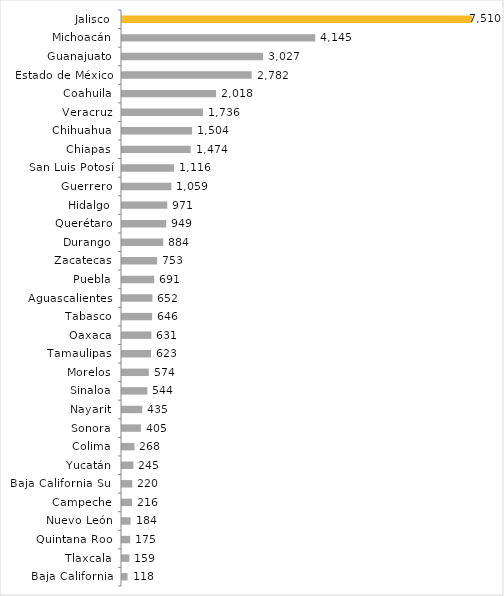
| Category | Producción de Carne en Canal |
|---|---|
| Baja California | 118 |
| Tlaxcala | 159 |
| Quintana Roo | 175 |
| Nuevo León | 184 |
| Campeche | 216 |
| Baja California Sur | 220 |
| Yucatán | 245 |
| Colima | 268 |
| Sonora | 405 |
| Nayarit | 435 |
| Sinaloa | 544 |
| Morelos | 574 |
| Tamaulipas | 623 |
| Oaxaca | 631 |
| Tabasco | 646 |
| Aguascalientes | 652 |
| Puebla | 691 |
| Zacatecas | 753 |
| Durango | 884 |
| Querétaro | 949 |
| Hidalgo | 971 |
| Guerrero | 1059 |
| San Luis Potosí | 1116 |
| Chiapas | 1474 |
| Chihuahua | 1504 |
| Veracruz | 1736 |
| Coahuila | 2018 |
| Estado de México | 2782 |
| Guanajuato | 3027 |
| Michoacán | 4145 |
| Jalisco | 7510 |